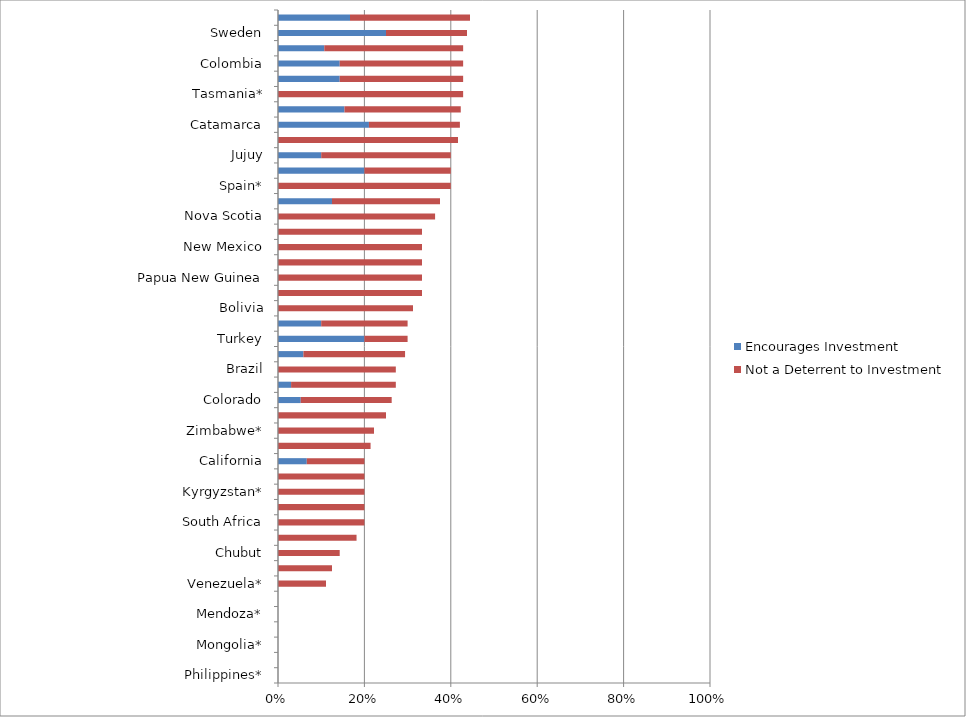
| Category | Encourages Investment | Not a Deterrent to Investment |
|---|---|---|
| Philippines* | 0 | 0 |
| Nicaragua* | 0 | 0 |
| Mongolia* | 0 | 0 |
| Minnesota* | 0 | 0 |
| Mendoza* | 0 | 0 |
| Liberia* | 0 | 0 |
| Venezuela* | 0 | 0.111 |
| China* | 0 | 0.125 |
| Chubut | 0 | 0.143 |
| Mali* | 0 | 0.182 |
| South Africa | 0 | 0.2 |
| New Zealand* | 0 | 0.2 |
| Kyrgyzstan* | 0 | 0.2 |
| Democratic Republic of Congo (DRC)* | 0 | 0.2 |
| California | 0.067 | 0.133 |
| New South Wales | 0 | 0.214 |
| Zimbabwe* | 0 | 0.222 |
| Indonesia | 0 | 0.25 |
| Colorado | 0.053 | 0.211 |
| Peru | 0.03 | 0.242 |
| Brazil | 0 | 0.273 |
| Northwest Territories | 0.059 | 0.235 |
| Turkey | 0.2 | 0.1 |
| Norway | 0.1 | 0.2 |
| Bolivia | 0 | 0.312 |
| Victoria | 0 | 0.333 |
| Papua New Guinea | 0 | 0.333 |
| Panama* | 0 | 0.333 |
| New Mexico | 0 | 0.333 |
| Greenland* | 0 | 0.333 |
| Nova Scotia | 0 | 0.364 |
| Washington* | 0.125 | 0.25 |
| Spain* | 0 | 0.4 |
| Michigan* | 0.2 | 0.2 |
| Jujuy | 0.1 | 0.3 |
| Montana | 0 | 0.417 |
| Catamarca | 0.211 | 0.211 |
| Manitoba | 0.154 | 0.269 |
| Tasmania* | 0 | 0.429 |
| Mauritania* | 0.143 | 0.286 |
| Colombia | 0.143 | 0.286 |
| Chile | 0.107 | 0.321 |
| Sweden | 0.25 | 0.188 |
| Nunavut | 0.167 | 0.278 |